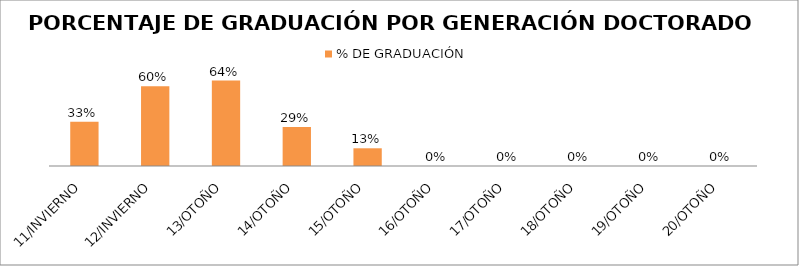
| Category | % DE GRADUACIÓN |
|---|---|
|  11/INVIERNO | 0.333 |
|  12/INVIERNO | 0.6 |
| 13/OTOÑO | 0.643 |
| 14/OTOÑO | 0.294 |
| 15/OTOÑO | 0.133 |
| 16/OTOÑO | 0 |
| 17/OTOÑO | 0 |
| 18/OTOÑO | 0 |
| 19/OTOÑO | 0 |
| 20/OTOÑO | 0 |